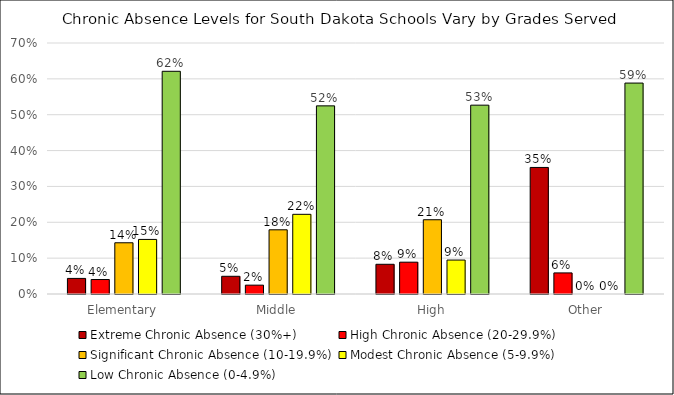
| Category | Extreme Chronic Absence (30%+) | High Chronic Absence (20-29.9%) | Significant Chronic Absence (10-19.9%) | Modest Chronic Absence (5-9.9%) | Low Chronic Absence (0-4.9%) |
|---|---|---|---|---|---|
| Elementary | 0.043 | 0.04 | 0.143 | 0.152 | 0.621 |
| Middle | 0.049 | 0.025 | 0.179 | 0.222 | 0.525 |
| High | 0.083 | 0.089 | 0.207 | 0.095 | 0.527 |
| Other | 0.353 | 0.059 | 0 | 0 | 0.588 |